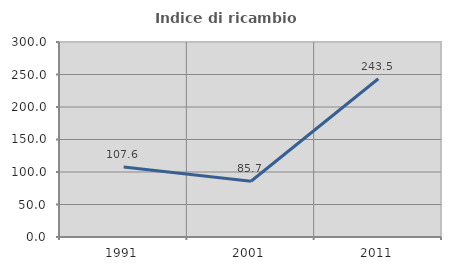
| Category | Indice di ricambio occupazionale  |
|---|---|
| 1991.0 | 107.595 |
| 2001.0 | 85.714 |
| 2011.0 | 243.478 |